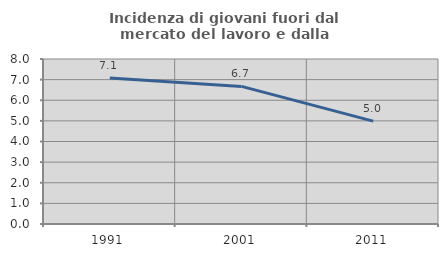
| Category | Incidenza di giovani fuori dal mercato del lavoro e dalla formazione  |
|---|---|
| 1991.0 | 7.074 |
| 2001.0 | 6.672 |
| 2011.0 | 4.989 |